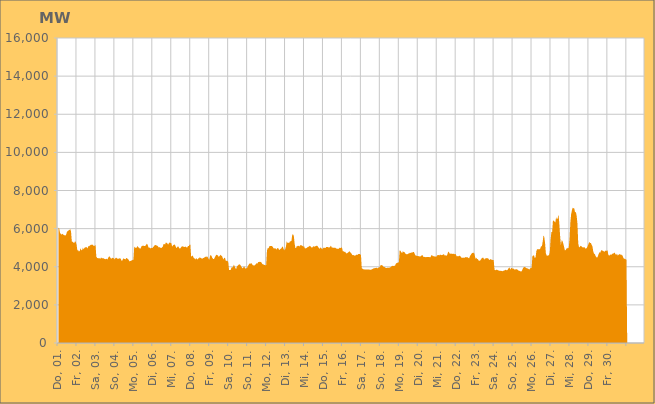
| Category | Series 0 |
|---|---|
|  Do, 01.  | 6062.192 |
|  Do, 01.  | 6013.177 |
|  Do, 01.  | 5785.254 |
|  Do, 01.  | 5726.139 |
|  Do, 01.  | 5682.856 |
|  Do, 01.  | 5738.497 |
|  Do, 01.  | 5683.695 |
|  Do, 01.  | 5677.78 |
|  Do, 01.  | 5643.222 |
|  Do, 01.  | 5641.844 |
|  Do, 01.  | 5703.315 |
|  Do, 01.  | 5871.575 |
|  Do, 01.  | 5847.022 |
|  Do, 01.  | 5921.517 |
|  Do, 01.  | 5921.652 |
|  Do, 01.  | 5983.023 |
|  Do, 01.  | 5840.281 |
|  Fr, 02.  | 5327.502 |
|  Fr, 02.  | 5306.029 |
|  Fr, 02.  | 5267.19 |
|  Fr, 02.  | 5243.998 |
|  Fr, 02.  | 5333.315 |
|  Fr, 02.  | 5305.246 |
|  Fr, 02.  | 5152.64 |
|  Fr, 02.  | 4866.945 |
|  Fr, 02.  | 4870.092 |
|  Fr, 02.  | 4800.94 |
|  Fr, 02.  | 4827.67 |
|  Fr, 02.  | 4971.02 |
|  Fr, 02.  | 4860.695 |
|  Fr, 02.  | 4879.31 |
|  Fr, 02.  | 4999.067 |
|  Fr, 02.  | 4911.188 |
|  Fr, 02.  | 4993.547 |
|  Fr, 02.  | 5029.466 |
|  Fr, 02.  | 5005.799 |
|  Fr, 02.  | 5035.411 |
|  Fr, 02.  | 4952.198 |
|  Fr, 02.  | 5088.969 |
|  Fr, 02.  | 5075.553 |
|  Fr, 02.  | 5117.367 |
|  Sa, 03.  | 5151.255 |
|  Sa, 03.  | 5151.811 |
|  Sa, 03.  | 5162.43 |
|  Sa, 03.  | 5124.667 |
|  Sa, 03.  | 5088.242 |
|  Sa, 03.  | 5100.668 |
|  Sa, 03.  | 5146.319 |
|  Sa, 03.  | 4532.205 |
|  Sa, 03.  | 4463.781 |
|  Sa, 03.  | 4449.273 |
|  Sa, 03.  | 4448.499 |
|  Sa, 03.  | 4449.815 |
|  Sa, 03.  | 4412.132 |
|  Sa, 03.  | 4489.104 |
|  Sa, 03.  | 4450.218 |
|  Sa, 03.  | 4450.386 |
|  Sa, 03.  | 4448.631 |
|  Sa, 03.  | 4416.517 |
|  Sa, 03.  | 4404.09 |
|  Sa, 03.  | 4397.389 |
|  Sa, 03.  | 4420.852 |
|  Sa, 03.  | 4384.921 |
|  Sa, 03.  | 4457.032 |
|  Sa, 03.  | 4539.416 |
|  So, 04.  | 4531.808 |
|  So, 04.  | 4455.94 |
|  So, 04.  | 4419.455 |
|  So, 04.  | 4460.108 |
|  So, 04.  | 4474.137 |
|  So, 04.  | 4440.203 |
|  So, 04.  | 4391.182 |
|  So, 04.  | 4439.338 |
|  So, 04.  | 4480.698 |
|  So, 04.  | 4446.007 |
|  So, 04.  | 4416.195 |
|  So, 04.  | 4420.905 |
|  So, 04.  | 4435.185 |
|  So, 04.  | 4450.807 |
|  So, 04.  | 4412.776 |
|  So, 04.  | 4312.905 |
|  So, 04.  | 4334.512 |
|  So, 04.  | 4433.877 |
|  So, 04.  | 4421.135 |
|  So, 04.  | 4402.792 |
|  So, 04.  | 4391.791 |
|  So, 04.  | 4466.776 |
|  So, 04.  | 4436.024 |
|  So, 04.  | 4407.477 |
|  Mo, 05.  | 4360.524 |
|  Mo, 05.  | 4281.849 |
|  Mo, 05.  | 4304.031 |
|  Mo, 05.  | 4313.109 |
|  Mo, 05.  | 4336.554 |
|  Mo, 05.  | 4359.289 |
|  Mo, 05.  | 4367.225 |
|  Mo, 05.  | 5047.301 |
|  Mo, 05.  | 5025.157 |
|  Mo, 05.  | 4977.024 |
|  Mo, 05.  | 5009.966 |
|  Mo, 05.  | 5090.524 |
|  Mo, 05.  | 5022.886 |
|  Mo, 05.  | 5004.49 |
|  Mo, 05.  | 4952.474 |
|  Mo, 05.  | 4950.392 |
|  Mo, 05.  | 5057.095 |
|  Mo, 05.  | 5094.527 |
|  Mo, 05.  | 5105.751 |
|  Mo, 05.  | 5098.557 |
|  Mo, 05.  | 5085.726 |
|  Mo, 05.  | 5090.904 |
|  Mo, 05.  | 5152.076 |
|  Mo, 05.  | 5206.654 |
|  Di, 06.  | 5147.21 |
|  Di, 06.  | 5012.479 |
|  Di, 06.  | 5011.463 |
|  Di, 06.  | 4969.716 |
|  Di, 06.  | 4973.515 |
|  Di, 06.  | 4994.36 |
|  Di, 06.  | 4979.336 |
|  Di, 06.  | 5040.384 |
|  Di, 06.  | 5069.956 |
|  Di, 06.  | 5142.11 |
|  Di, 06.  | 5144.025 |
|  Di, 06.  | 5118.893 |
|  Di, 06.  | 5104.549 |
|  Di, 06.  | 5074.945 |
|  Di, 06.  | 5007.916 |
|  Di, 06.  | 5030.42 |
|  Di, 06.  | 5002.783 |
|  Di, 06.  | 4978.839 |
|  Di, 06.  | 5008.471 |
|  Di, 06.  | 5045.048 |
|  Di, 06.  | 5177.66 |
|  Di, 06.  | 5204.033 |
|  Di, 06.  | 5153.769 |
|  Di, 06.  | 5270.74 |
|  Mi, 07.  | 5256.074 |
|  Mi, 07.  | 5221.883 |
|  Mi, 07.  | 5160.586 |
|  Mi, 07.  | 5239.913 |
|  Mi, 07.  | 5276.632 |
|  Mi, 07.  | 5248.599 |
|  Mi, 07.  | 5232.668 |
|  Mi, 07.  | 5050.628 |
|  Mi, 07.  | 5124.452 |
|  Mi, 07.  | 5145.786 |
|  Mi, 07.  | 5174.365 |
|  Mi, 07.  | 5115.166 |
|  Mi, 07.  | 5000.828 |
|  Mi, 07.  | 5000.093 |
|  Mi, 07.  | 5067.893 |
|  Mi, 07.  | 5057.326 |
|  Mi, 07.  | 4969.996 |
|  Mi, 07.  | 4955.199 |
|  Mi, 07.  | 5003.376 |
|  Mi, 07.  | 5058.117 |
|  Mi, 07.  | 5072.921 |
|  Mi, 07.  | 5057.133 |
|  Mi, 07.  | 5049.666 |
|  Mi, 07.  | 5034.097 |
|  Do, 08.  | 5057.191 |
|  Do, 08.  | 5020.641 |
|  Do, 08.  | 5002.473 |
|  Do, 08.  | 5085.675 |
|  Do, 08.  | 5082.761 |
|  Do, 08.  | 5151.54 |
|  Do, 08.  | 5175.485 |
|  Do, 08.  | 4532.727 |
|  Do, 08.  | 4559.928 |
|  Do, 08.  | 4596.835 |
|  Do, 08.  | 4486.844 |
|  Do, 08.  | 4440.119 |
|  Do, 08.  | 4432.734 |
|  Do, 08.  | 4375.566 |
|  Do, 08.  | 4462.4 |
|  Do, 08.  | 4367.842 |
|  Do, 08.  | 4440.16 |
|  Do, 08.  | 4438.343 |
|  Do, 08.  | 4505.986 |
|  Do, 08.  | 4465.86 |
|  Do, 08.  | 4441.707 |
|  Do, 08.  | 4422.172 |
|  Do, 08.  | 4451.675 |
|  Do, 08.  | 4462.566 |
|  Fr, 09.  | 4495.167 |
|  Fr, 09.  | 4532.336 |
|  Fr, 09.  | 4499.25 |
|  Fr, 09.  | 4551.107 |
|  Fr, 09.  | 4506.388 |
|  Fr, 09.  | 4417.102 |
|  Fr, 09.  | 4372.801 |
|  Fr, 09.  | 4570.8 |
|  Fr, 09.  | 4617.046 |
|  Fr, 09.  | 4546.723 |
|  Fr, 09.  | 4451.907 |
|  Fr, 09.  | 4405.212 |
|  Fr, 09.  | 4411.805 |
|  Fr, 09.  | 4493.371 |
|  Fr, 09.  | 4577.272 |
|  Fr, 09.  | 4632.36 |
|  Fr, 09.  | 4605.186 |
|  Fr, 09.  | 4596.209 |
|  Fr, 09.  | 4512.075 |
|  Fr, 09.  | 4558.575 |
|  Fr, 09.  | 4632.174 |
|  Fr, 09.  | 4574.396 |
|  Fr, 09.  | 4576.039 |
|  Fr, 09.  | 4456.656 |
|  Sa, 10.  | 4386.355 |
|  Sa, 10.  | 4474.539 |
|  Sa, 10.  | 4454.903 |
|  Sa, 10.  | 4298.281 |
|  Sa, 10.  | 4320.93 |
|  Sa, 10.  | 4299.587 |
|  Sa, 10.  | 4252.892 |
|  Sa, 10.  | 3826.748 |
|  Sa, 10.  | 3831.674 |
|  Sa, 10.  | 3832.815 |
|  Sa, 10.  | 3946.033 |
|  Sa, 10.  | 3978.052 |
|  Sa, 10.  | 3972.623 |
|  Sa, 10.  | 4112.563 |
|  Sa, 10.  | 4028.367 |
|  Sa, 10.  | 3930.154 |
|  Sa, 10.  | 3883.292 |
|  Sa, 10.  | 4017.49 |
|  Sa, 10.  | 4053.866 |
|  Sa, 10.  | 4096.868 |
|  Sa, 10.  | 4129.763 |
|  Sa, 10.  | 4109.327 |
|  Sa, 10.  | 4046.045 |
|  Sa, 10.  | 3975.956 |
|  So, 11.  | 3910.764 |
|  So, 11.  | 3947.871 |
|  So, 11.  | 4025.238 |
|  So, 11.  | 3955.615 |
|  So, 11.  | 3895.483 |
|  So, 11.  | 3919.904 |
|  So, 11.  | 3954.057 |
|  So, 11.  | 4050.584 |
|  So, 11.  | 4112.915 |
|  So, 11.  | 4176.227 |
|  So, 11.  | 4153.831 |
|  So, 11.  | 4197.33 |
|  So, 11.  | 4142.476 |
|  So, 11.  | 4085.9 |
|  So, 11.  | 4069.23 |
|  So, 11.  | 4070.21 |
|  So, 11.  | 4090.302 |
|  So, 11.  | 4144.867 |
|  So, 11.  | 4183.565 |
|  So, 11.  | 4168.425 |
|  So, 11.  | 4254.2 |
|  So, 11.  | 4243.641 |
|  So, 11.  | 4262.304 |
|  So, 11.  | 4251.176 |
|  Mo, 12.  | 4222.62 |
|  Mo, 12.  | 4144.598 |
|  Mo, 12.  | 4130.704 |
|  Mo, 12.  | 4111.21 |
|  Mo, 12.  | 4091.229 |
|  Mo, 12.  | 4075.639 |
|  Mo, 12.  | 4090.345 |
|  Mo, 12.  | 4851.02 |
|  Mo, 12.  | 4985.009 |
|  Mo, 12.  | 4967.893 |
|  Mo, 12.  | 5070.163 |
|  Mo, 12.  | 5091.883 |
|  Mo, 12.  | 5081.709 |
|  Mo, 12.  | 5087.628 |
|  Mo, 12.  | 5062.958 |
|  Mo, 12.  | 4995.318 |
|  Mo, 12.  | 4945.224 |
|  Mo, 12.  | 4978.739 |
|  Mo, 12.  | 4951.444 |
|  Mo, 12.  | 4903.372 |
|  Mo, 12.  | 4972.329 |
|  Mo, 12.  | 4992.292 |
|  Mo, 12.  | 4906.2 |
|  Mo, 12.  | 4882.812 |
|  Di, 13.  | 4934.059 |
|  Di, 13.  | 4957.173 |
|  Di, 13.  | 5022.655 |
|  Di, 13.  | 5065.508 |
|  Di, 13.  | 4939.261 |
|  Di, 13.  | 4869.223 |
|  Di, 13.  | 4917.91 |
|  Di, 13.  | 5055.208 |
|  Di, 13.  | 5347.028 |
|  Di, 13.  | 5246.843 |
|  Di, 13.  | 5266.813 |
|  Di, 13.  | 5238.056 |
|  Di, 13.  | 5324.352 |
|  Di, 13.  | 5336.672 |
|  Di, 13.  | 5353.714 |
|  Di, 13.  | 5681.251 |
|  Di, 13.  | 5703.767 |
|  Di, 13.  | 5613.957 |
|  Di, 13.  | 5221.567 |
|  Di, 13.  | 4976.31 |
|  Di, 13.  | 4994.932 |
|  Di, 13.  | 5106.396 |
|  Di, 13.  | 5068.016 |
|  Di, 13.  | 5109.203 |
|  Mi, 14.  | 5062.628 |
|  Mi, 14.  | 5118.607 |
|  Mi, 14.  | 5137.209 |
|  Mi, 14.  | 5116.062 |
|  Mi, 14.  | 5099.678 |
|  Mi, 14.  | 5049.881 |
|  Mi, 14.  | 5080.367 |
|  Mi, 14.  | 4962.523 |
|  Mi, 14.  | 4964.573 |
|  Mi, 14.  | 4984.022 |
|  Mi, 14.  | 5010.926 |
|  Mi, 14.  | 5046.826 |
|  Mi, 14.  | 5049.768 |
|  Mi, 14.  | 5097.222 |
|  Mi, 14.  | 5075.812 |
|  Mi, 14.  | 5033.318 |
|  Mi, 14.  | 4983.729 |
|  Mi, 14.  | 5052.135 |
|  Mi, 14.  | 5078.541 |
|  Mi, 14.  | 5051.699 |
|  Mi, 14.  | 5072.616 |
|  Mi, 14.  | 5084.568 |
|  Mi, 14.  | 5108.069 |
|  Mi, 14.  | 5087.903 |
|  Do, 15.  | 5027.612 |
|  Do, 15.  | 4962.737 |
|  Do, 15.  | 4961.332 |
|  Do, 15.  | 5019.798 |
|  Do, 15.  | 4964.658 |
|  Do, 15.  | 4909.993 |
|  Do, 15.  | 4971.705 |
|  Do, 15.  | 5006.592 |
|  Do, 15.  | 4991.212 |
|  Do, 15.  | 4982.761 |
|  Do, 15.  | 5037.621 |
|  Do, 15.  | 5038.822 |
|  Do, 15.  | 5032.939 |
|  Do, 15.  | 5012.677 |
|  Do, 15.  | 5011.756 |
|  Do, 15.  | 5046.803 |
|  Do, 15.  | 5110.413 |
|  Do, 15.  | 5007.242 |
|  Do, 15.  | 5004.874 |
|  Do, 15.  | 4993.037 |
|  Do, 15.  | 4992.232 |
|  Do, 15.  | 5003.263 |
|  Do, 15.  | 4984.793 |
|  Do, 15.  | 4946.758 |
|  Fr, 16.  | 4946.911 |
|  Fr, 16.  | 4935.595 |
|  Fr, 16.  | 4952.044 |
|  Fr, 16.  | 4996.482 |
|  Fr, 16.  | 4976.067 |
|  Fr, 16.  | 5015.213 |
|  Fr, 16.  | 4997.774 |
|  Fr, 16.  | 4814.052 |
|  Fr, 16.  | 4818.325 |
|  Fr, 16.  | 4777.149 |
|  Fr, 16.  | 4794.076 |
|  Fr, 16.  | 4706.888 |
|  Fr, 16.  | 4698.509 |
|  Fr, 16.  | 4731.178 |
|  Fr, 16.  | 4752.108 |
|  Fr, 16.  | 4796.22 |
|  Fr, 16.  | 4795.419 |
|  Fr, 16.  | 4726.049 |
|  Fr, 16.  | 4690.4 |
|  Fr, 16.  | 4609.037 |
|  Fr, 16.  | 4612.469 |
|  Fr, 16.  | 4607.707 |
|  Fr, 16.  | 4576.775 |
|  Fr, 16.  | 4586.293 |
|  Sa, 17.  | 4632.953 |
|  Sa, 17.  | 4620.566 |
|  Sa, 17.  | 4635.793 |
|  Sa, 17.  | 4673.455 |
|  Sa, 17.  | 4670.458 |
|  Sa, 17.  | 4658.653 |
|  Sa, 17.  | 4614.741 |
|  Sa, 17.  | 3918.069 |
|  Sa, 17.  | 3901.638 |
|  Sa, 17.  | 3864.38 |
|  Sa, 17.  | 3863.906 |
|  Sa, 17.  | 3857.695 |
|  Sa, 17.  | 3856.097 |
|  Sa, 17.  | 3849.683 |
|  Sa, 17.  | 3854.737 |
|  Sa, 17.  | 3863.727 |
|  Sa, 17.  | 3847.8 |
|  Sa, 17.  | 3850.926 |
|  Sa, 17.  | 3839.768 |
|  Sa, 17.  | 3850.006 |
|  Sa, 17.  | 3873.027 |
|  Sa, 17.  | 3888.648 |
|  Sa, 17.  | 3922.193 |
|  Sa, 17.  | 3923.327 |
|  So, 18.  | 3931.202 |
|  So, 18.  | 3936.681 |
|  So, 18.  | 3953.722 |
|  So, 18.  | 3909.536 |
|  So, 18.  | 3959.901 |
|  So, 18.  | 3966.292 |
|  So, 18.  | 3995.948 |
|  So, 18.  | 4092.466 |
|  So, 18.  | 4084.85 |
|  So, 18.  | 4077.997 |
|  So, 18.  | 4019.915 |
|  So, 18.  | 3985.188 |
|  So, 18.  | 3984.288 |
|  So, 18.  | 3953.504 |
|  So, 18.  | 3927.466 |
|  So, 18.  | 3942.054 |
|  So, 18.  | 3944.421 |
|  So, 18.  | 3949.218 |
|  So, 18.  | 3950.969 |
|  So, 18.  | 3971.674 |
|  So, 18.  | 3987.109 |
|  So, 18.  | 4042.158 |
|  So, 18.  | 4048.817 |
|  So, 18.  | 4036.321 |
|  Mo, 19.  | 4054.894 |
|  Mo, 19.  | 4047.929 |
|  Mo, 19.  | 4145.573 |
|  Mo, 19.  | 4191.02 |
|  Mo, 19.  | 4217.054 |
|  Mo, 19.  | 4205.233 |
|  Mo, 19.  | 4256.448 |
|  Mo, 19.  | 4882.546 |
|  Mo, 19.  | 4835.612 |
|  Mo, 19.  | 4767.495 |
|  Mo, 19.  | 4712.046 |
|  Mo, 19.  | 4815.012 |
|  Mo, 19.  | 4776.239 |
|  Mo, 19.  | 4770.684 |
|  Mo, 19.  | 4697.743 |
|  Mo, 19.  | 4666.37 |
|  Mo, 19.  | 4648.768 |
|  Mo, 19.  | 4664.001 |
|  Mo, 19.  | 4690.102 |
|  Mo, 19.  | 4698.601 |
|  Mo, 19.  | 4736.014 |
|  Mo, 19.  | 4723.119 |
|  Mo, 19.  | 4747.433 |
|  Mo, 19.  | 4751.154 |
|  Di, 20.  | 4772.502 |
|  Di, 20.  | 4780.394 |
|  Di, 20.  | 4675.396 |
|  Di, 20.  | 4589.158 |
|  Di, 20.  | 4594.06 |
|  Di, 20.  | 4557.674 |
|  Di, 20.  | 4568.424 |
|  Di, 20.  | 4556.343 |
|  Di, 20.  | 4545.254 |
|  Di, 20.  | 4532.008 |
|  Di, 20.  | 4567.64 |
|  Di, 20.  | 4598.669 |
|  Di, 20.  | 4612.061 |
|  Di, 20.  | 4522.215 |
|  Di, 20.  | 4505.887 |
|  Di, 20.  | 4522.473 |
|  Di, 20.  | 4495.732 |
|  Di, 20.  | 4510.904 |
|  Di, 20.  | 4505.972 |
|  Di, 20.  | 4515.08 |
|  Di, 20.  | 4517.289 |
|  Di, 20.  | 4497.842 |
|  Di, 20.  | 4492.896 |
|  Di, 20.  | 4602.173 |
|  Mi, 21.  | 4610.721 |
|  Mi, 21.  | 4549.497 |
|  Mi, 21.  | 4558.362 |
|  Mi, 21.  | 4534.749 |
|  Mi, 21.  | 4536.086 |
|  Mi, 21.  | 4527.312 |
|  Mi, 21.  | 4552.143 |
|  Mi, 21.  | 4620.503 |
|  Mi, 21.  | 4622.05 |
|  Mi, 21.  | 4587.328 |
|  Mi, 21.  | 4637.346 |
|  Mi, 21.  | 4625.465 |
|  Mi, 21.  | 4608.799 |
|  Mi, 21.  | 4614.292 |
|  Mi, 21.  | 4643.314 |
|  Mi, 21.  | 4655.361 |
|  Mi, 21.  | 4587.187 |
|  Mi, 21.  | 4604.991 |
|  Mi, 21.  | 4568.392 |
|  Mi, 21.  | 4616.322 |
|  Mi, 21.  | 4735.872 |
|  Mi, 21.  | 4798.546 |
|  Mi, 21.  | 4701.647 |
|  Mi, 21.  | 4682.157 |
|  Do, 22.  | 4691.63 |
|  Do, 22.  | 4677 |
|  Do, 22.  | 4673.529 |
|  Do, 22.  | 4683.67 |
|  Do, 22.  | 4667.569 |
|  Do, 22.  | 4654.377 |
|  Do, 22.  | 4664.253 |
|  Do, 22.  | 4549.714 |
|  Do, 22.  | 4557.44 |
|  Do, 22.  | 4544.478 |
|  Do, 22.  | 4565.179 |
|  Do, 22.  | 4585.329 |
|  Do, 22.  | 4546.423 |
|  Do, 22.  | 4480.927 |
|  Do, 22.  | 4460.06 |
|  Do, 22.  | 4485.164 |
|  Do, 22.  | 4472.555 |
|  Do, 22.  | 4466.264 |
|  Do, 22.  | 4507.147 |
|  Do, 22.  | 4500.536 |
|  Do, 22.  | 4497.936 |
|  Do, 22.  | 4500.353 |
|  Do, 22.  | 4459.587 |
|  Do, 22.  | 4443.701 |
|  Fr, 23.  | 4564.943 |
|  Fr, 23.  | 4623.65 |
|  Fr, 23.  | 4687.292 |
|  Fr, 23.  | 4728.96 |
|  Fr, 23.  | 4710.948 |
|  Fr, 23.  | 4747.324 |
|  Fr, 23.  | 4601.97 |
|  Fr, 23.  | 4409.447 |
|  Fr, 23.  | 4479.932 |
|  Fr, 23.  | 4399.084 |
|  Fr, 23.  | 4412.877 |
|  Fr, 23.  | 4319.168 |
|  Fr, 23.  | 4310.648 |
|  Fr, 23.  | 4336.504 |
|  Fr, 23.  | 4391.259 |
|  Fr, 23.  | 4454.351 |
|  Fr, 23.  | 4478.687 |
|  Fr, 23.  | 4465.868 |
|  Fr, 23.  | 4368.598 |
|  Fr, 23.  | 4447.687 |
|  Fr, 23.  | 4428.118 |
|  Fr, 23.  | 4455.612 |
|  Fr, 23.  | 4440.443 |
|  Fr, 23.  | 4440.94 |
|  Sa, 24.  | 4377.235 |
|  Sa, 24.  | 4355.236 |
|  Sa, 24.  | 4402.915 |
|  Sa, 24.  | 4378.173 |
|  Sa, 24.  | 4358.034 |
|  Sa, 24.  | 4361.802 |
|  Sa, 24.  | 4345.013 |
|  Sa, 24.  | 3855.673 |
|  Sa, 24.  | 3814.623 |
|  Sa, 24.  | 3829.925 |
|  Sa, 24.  | 3852.09 |
|  Sa, 24.  | 3822.071 |
|  Sa, 24.  | 3803.069 |
|  Sa, 24.  | 3798.491 |
|  Sa, 24.  | 3773.341 |
|  Sa, 24.  | 3797.672 |
|  Sa, 24.  | 3774.741 |
|  Sa, 24.  | 3767.163 |
|  Sa, 24.  | 3785.206 |
|  Sa, 24.  | 3788.596 |
|  Sa, 24.  | 3820.575 |
|  Sa, 24.  | 3847.662 |
|  Sa, 24.  | 3814.998 |
|  Sa, 24.  | 3822.017 |
|  So, 25.  | 3859.202 |
|  So, 25.  | 3935.236 |
|  So, 25.  | 3958.065 |
|  So, 25.  | 3846.177 |
|  So, 25.  | 3936.6 |
|  So, 25.  | 3924.857 |
|  So, 25.  | 3899.782 |
|  So, 25.  | 3905.384 |
|  So, 25.  | 3862.239 |
|  So, 25.  | 3851.927 |
|  So, 25.  | 3872.45 |
|  So, 25.  | 3869.999 |
|  So, 25.  | 3852.975 |
|  So, 25.  | 3813.626 |
|  So, 25.  | 3786.961 |
|  So, 25.  | 3781.665 |
|  So, 25.  | 3756.475 |
|  So, 25.  | 3752.646 |
|  So, 25.  | 3815.895 |
|  So, 25.  | 3916.241 |
|  So, 25.  | 3975.456 |
|  So, 25.  | 3986.867 |
|  So, 25.  | 3971.937 |
|  So, 25.  | 3933.238 |
|  Mo, 26.  | 3920.94 |
|  Mo, 26.  | 3908.956 |
|  Mo, 26.  | 3894.649 |
|  Mo, 26.  | 3850.886 |
|  Mo, 26.  | 3907.33 |
|  Mo, 26.  | 3948.566 |
|  Mo, 26.  | 3944.359 |
|  Mo, 26.  | 4560.589 |
|  Mo, 26.  | 4590.136 |
|  Mo, 26.  | 4597.668 |
|  Mo, 26.  | 4449.781 |
|  Mo, 26.  | 4501.61 |
|  Mo, 26.  | 4818.396 |
|  Mo, 26.  | 4923.707 |
|  Mo, 26.  | 4911.527 |
|  Mo, 26.  | 4920.382 |
|  Mo, 26.  | 4909.994 |
|  Mo, 26.  | 4958.829 |
|  Mo, 26.  | 5077.141 |
|  Mo, 26.  | 5073.851 |
|  Mo, 26.  | 5309.666 |
|  Mo, 26.  | 5649.645 |
|  Mo, 26.  | 5558.699 |
|  Mo, 26.  | 5253.009 |
|  Di, 27.  | 4717.004 |
|  Di, 27.  | 4586.4 |
|  Di, 27.  | 4580.36 |
|  Di, 27.  | 4597.283 |
|  Di, 27.  | 4600.951 |
|  Di, 27.  | 4772.745 |
|  Di, 27.  | 5417.838 |
|  Di, 27.  | 5815.367 |
|  Di, 27.  | 5835.996 |
|  Di, 27.  | 6432.441 |
|  Di, 27.  | 6410.903 |
|  Di, 27.  | 6373.062 |
|  Di, 27.  | 6318.271 |
|  Di, 27.  | 6596.31 |
|  Di, 27.  | 6482.437 |
|  Di, 27.  | 6544.097 |
|  Di, 27.  | 6745.314 |
|  Di, 27.  | 6300.994 |
|  Di, 27.  | 5654.233 |
|  Di, 27.  | 5142.641 |
|  Di, 27.  | 5383.265 |
|  Di, 27.  | 5359.448 |
|  Di, 27.  | 5227.911 |
|  Di, 27.  | 5059.606 |
|  Mi, 28.  | 4869.646 |
|  Mi, 28.  | 4869.833 |
|  Mi, 28.  | 4947.161 |
|  Mi, 28.  | 4994.221 |
|  Mi, 28.  | 4954.27 |
|  Mi, 28.  | 5012.271 |
|  Mi, 28.  | 5446.864 |
|  Mi, 28.  | 6319.417 |
|  Mi, 28.  | 6753.247 |
|  Mi, 28.  | 6965.791 |
|  Mi, 28.  | 7093.825 |
|  Mi, 28.  | 7068.851 |
|  Mi, 28.  | 7059.709 |
|  Mi, 28.  | 6848.436 |
|  Mi, 28.  | 6876.617 |
|  Mi, 28.  | 6661.524 |
|  Mi, 28.  | 6263.012 |
|  Mi, 28.  | 5234.941 |
|  Mi, 28.  | 5020.218 |
|  Mi, 28.  | 5037.755 |
|  Mi, 28.  | 5103.153 |
|  Mi, 28.  | 5076.963 |
|  Mi, 28.  | 5034.797 |
|  Mi, 28.  | 5008.965 |
|  Do, 29.  | 5018.733 |
|  Do, 29.  | 5029.582 |
|  Do, 29.  | 4954.178 |
|  Do, 29.  | 4957.105 |
|  Do, 29.  | 4995.751 |
|  Do, 29.  | 5091.552 |
|  Do, 29.  | 5197.23 |
|  Do, 29.  | 5303.328 |
|  Do, 29.  | 5242.472 |
|  Do, 29.  | 5244.91 |
|  Do, 29.  | 5146.321 |
|  Do, 29.  | 5067.199 |
|  Do, 29.  | 4804.922 |
|  Do, 29.  | 4685.943 |
|  Do, 29.  | 4662.27 |
|  Do, 29.  | 4558.664 |
|  Do, 29.  | 4497.509 |
|  Do, 29.  | 4480.502 |
|  Do, 29.  | 4564.459 |
|  Do, 29.  | 4688.889 |
|  Do, 29.  | 4760.413 |
|  Do, 29.  | 4750.746 |
|  Do, 29.  | 4867.407 |
|  Do, 29.  | 4854 |
|  Fr, 30.  | 4843.537 |
|  Fr, 30.  | 4821.641 |
|  Fr, 30.  | 4777.454 |
|  Fr, 30.  | 4829.398 |
|  Fr, 30.  | 4846.143 |
|  Fr, 30.  | 4836.409 |
|  Fr, 30.  | 4868.215 |
|  Fr, 30.  | 4645.303 |
|  Fr, 30.  | 4573.003 |
|  Fr, 30.  | 4614.111 |
|  Fr, 30.  | 4641.079 |
|  Fr, 30.  | 4625.609 |
|  Fr, 30.  | 4680.407 |
|  Fr, 30.  | 4692.274 |
|  Fr, 30.  | 4708.293 |
|  Fr, 30.  | 4746.409 |
|  Fr, 30.  | 4666.314 |
|  Fr, 30.  | 4617.315 |
|  Fr, 30.  | 4686.617 |
|  Fr, 30.  | 4588.848 |
|  Fr, 30.  | 4627.21 |
|  Fr, 30.  | 4668.076 |
|  Fr, 30.  | 4632.009 |
|  Fr, 30.  | 4647.07 |
|  Sa, 01.  | 4610.752 |
|  Sa, 01.  | 4594.298 |
|  Sa, 01.  | 4473.305 |
|  Sa, 01.  | 4423.92 |
|  Sa, 01.  | 4422.382 |
|  Sa, 01.  | 4389.186 |
|    | 4366.767 |
|    | 0 |
|    | 0 |
|    | 0 |
|    | 0 |
|    | 0 |
|    | 0 |
|    | 0 |
|    | 0 |
|    | 0 |
|    | 0 |
|    | 0 |
|    | 0 |
|    | 0 |
|    | 0 |
|    | 0 |
|    | 0 |
|    | 0 |
|    | 0 |
|    | 0 |
|    | 0 |
|    | 0 |
|    | 0 |
|    | 0 |